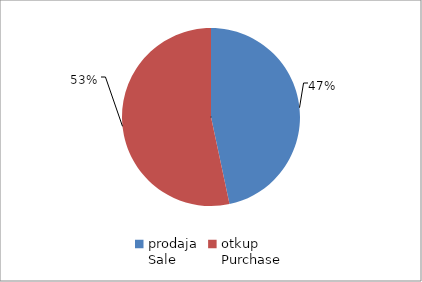
| Category | Series 0 |
|---|---|
| prodaja
Sale | 12587477 |
| otkup
Purchase | 14385682 |